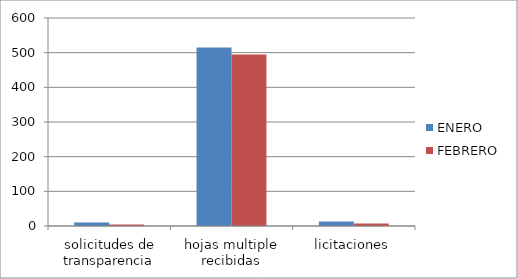
| Category | ENERO | FEBRERO |
|---|---|---|
| solicitudes de transparencia | 10 | 4 |
| hojas multiple recibidas | 515 | 495 |
| licitaciones | 13 | 7 |